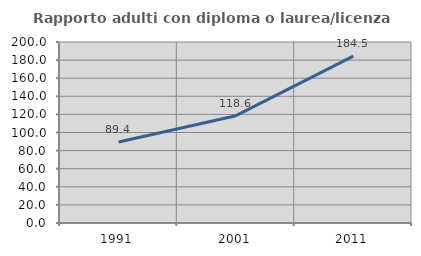
| Category | Rapporto adulti con diploma o laurea/licenza media  |
|---|---|
| 1991.0 | 89.406 |
| 2001.0 | 118.579 |
| 2011.0 | 184.469 |